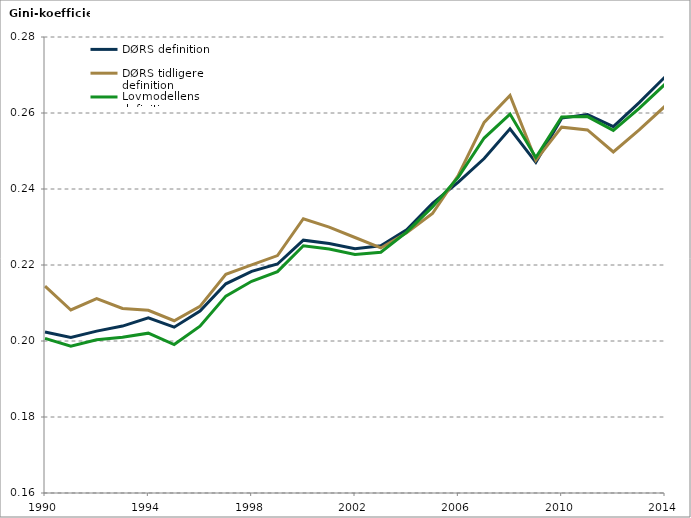
| Category | DØRS definition | DØRS tidligere definition | Lovmodellens definition |
|---|---|---|---|
| 1990.0 | 0.202 | 0.214 | 0.201 |
| 1991.0 | 0.201 | 0.208 | 0.199 |
| 1992.0 | 0.203 | 0.211 | 0.2 |
| 1993.0 | 0.204 | 0.209 | 0.201 |
| 1994.0 | 0.206 | 0.208 | 0.202 |
| 1995.0 | 0.204 | 0.205 | 0.199 |
| 1996.0 | 0.208 | 0.209 | 0.204 |
| 1997.0 | 0.215 | 0.218 | 0.212 |
| 1998.0 | 0.218 | 0.22 | 0.216 |
| 1999.0 | 0.22 | 0.222 | 0.218 |
| 2000.0 | 0.227 | 0.232 | 0.225 |
| 2001.0 | 0.226 | 0.23 | 0.224 |
| 2002.0 | 0.224 | 0.227 | 0.223 |
| 2003.0 | 0.225 | 0.224 | 0.223 |
| 2004.0 | 0.229 | 0.228 | 0.229 |
| 2005.0 | 0.236 | 0.234 | 0.235 |
| 2006.0 | 0.242 | 0.244 | 0.243 |
| 2007.0 | 0.248 | 0.258 | 0.253 |
| 2008.0 | 0.256 | 0.265 | 0.26 |
| 2009.0 | 0.247 | 0.248 | 0.248 |
| 2010.0 | 0.259 | 0.256 | 0.259 |
| 2011.0 | 0.26 | 0.256 | 0.259 |
| 2012.0 | 0.256 | 0.25 | 0.255 |
| 2013.0 | 0.263 | 0.256 | 0.261 |
| 2014.0 | 0.269 | 0.262 | 0.268 |